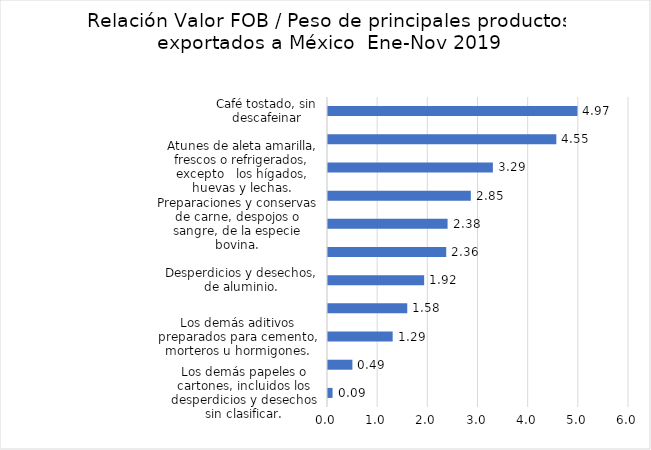
| Category | Series 0 |
|---|---|
| Los demás papeles o cartones, incluidos los desperdicios y desechos sin clasificar. | 0.09 |
| Aceite de palma y sus fracciones, en bruto. | 0.486 |
| Los demás aditivos preparados para cemento, morteros u hormigones. | 1.289 |
| Despojos comestibles de animales de la especie bovina, frescos o refrigerados. | 1.58 |
| Desperdicios y desechos, de aluminio. | 1.917 |
| Rayas (Rajidae), en filetes, frescos o refrigerados | 2.357 |
| Preparaciones y conservas de carne, despojos o sangre, de la especie bovina. | 2.384 |
| Vigas para encofrados, de aleaciones, de aluminio. | 2.847 |
| Atunes de aleta amarilla, frescos o refrigerados, excepto   los hígados, huevas y lechas. | 3.287 |
| Las demás disoluciones de pinturas | 4.551 |
| Café tostado, sin descafeinar | 4.973 |